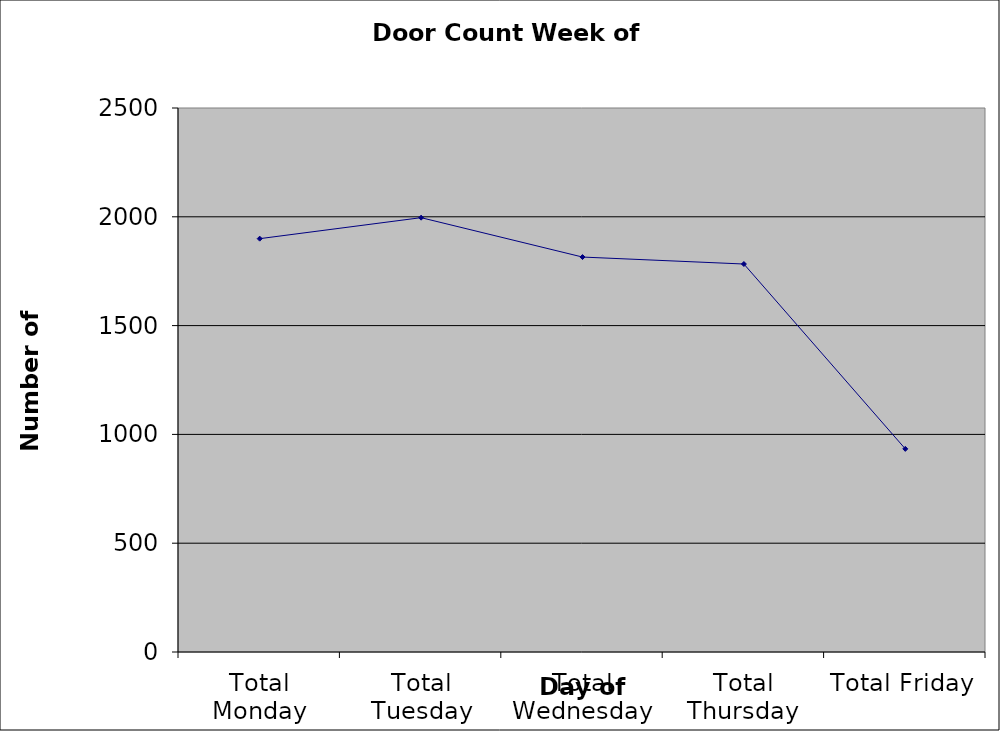
| Category | Series 0 |
|---|---|
| Total Monday | 1899.5 |
| Total Tuesday | 1996 |
| Total Wednesday | 1815 |
| Total Thursday | 1783 |
| Total Friday | 933.5 |